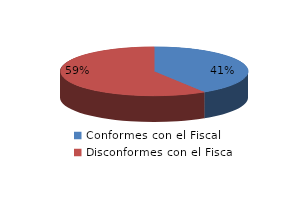
| Category | Series 0 |
|---|---|
| 0 | 96 |
| 1 | 138 |